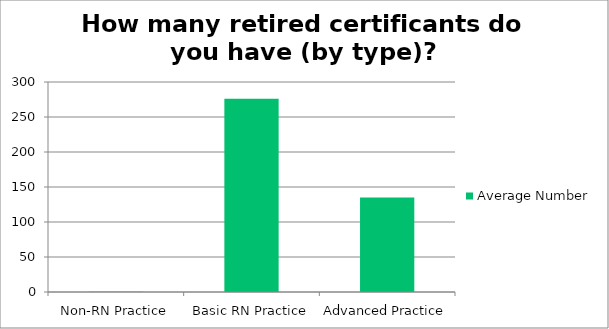
| Category | Average Number |
|---|---|
| Non-RN Practice | 0.5 |
| Basic RN Practice | 275.923 |
| Advanced Practice | 134.9 |